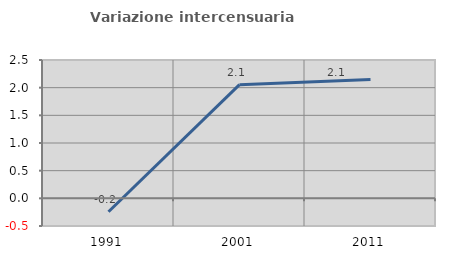
| Category | Variazione intercensuaria annua |
|---|---|
| 1991.0 | -0.242 |
| 2001.0 | 2.054 |
| 2011.0 | 2.146 |